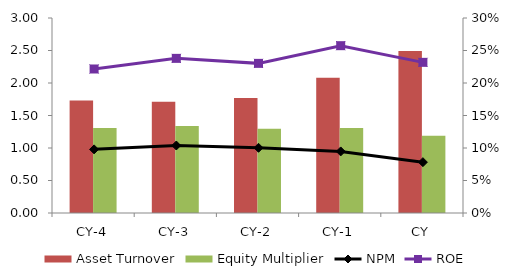
| Category | Asset Turnover | Equity Multiplier |
|---|---|---|
| CY-4 | 1.731 | 1.308 |
| CY-3 | 1.71 | 1.34 |
| CY-2 | 1.771 | 1.296 |
| CY-1 | 2.081 | 1.306 |
| CY | 2.492 | 1.189 |